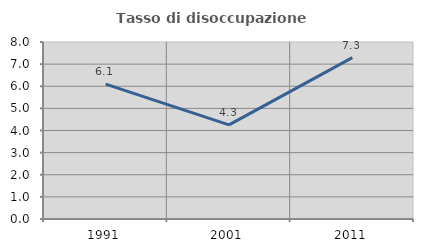
| Category | Tasso di disoccupazione giovanile  |
|---|---|
| 1991.0 | 6.098 |
| 2001.0 | 4.255 |
| 2011.0 | 7.292 |